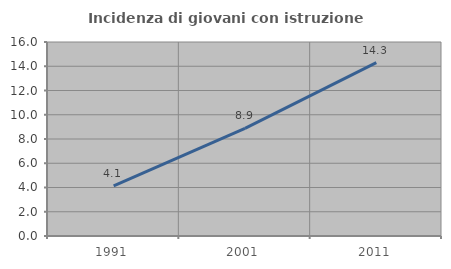
| Category | Incidenza di giovani con istruzione universitaria |
|---|---|
| 1991.0 | 4.128 |
| 2001.0 | 8.872 |
| 2011.0 | 14.292 |